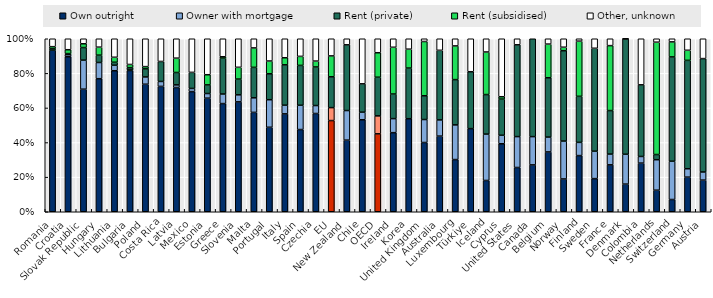
| Category | Own outright  | Owner with mortgage | Rent (private) | Rent (subsidised) | Other, unknown |
|---|---|---|---|---|---|
| Romania | 0.934 | 0 | 0.008 | 0.013 | 0.046 |
| Croatia | 0.896 | 0.012 | 0.006 | 0.022 | 0.063 |
| Slovak Republic | 0.709 | 0.168 | 0.073 | 0.022 | 0.029 |
| Hungary | 0.769 | 0.094 | 0.042 | 0.046 | 0.048 |
| Lithuania | 0.815 | 0.032 | 0.017 | 0.029 | 0.107 |
| Bulgaria | 0.817 | 0.003 | 0.013 | 0.018 | 0.149 |
| Poland | 0.737 | 0.042 | 0.047 | 0.013 | 0.161 |
| Costa Rica | 0.725 | 0.029 | 0.116 | 0 | 0.131 |
| Latvia | 0.718 | 0.015 | 0.072 | 0.083 | 0.112 |
| Mexico | 0.695 | 0.018 | 0.093 | 0 | 0.194 |
| Estonia | 0.657 | 0.027 | 0.05 | 0.059 | 0.208 |
| Greece | 0.625 | 0.055 | 0.207 | 0.008 | 0.104 |
| Slovenia | 0.635 | 0.041 | 0.091 | 0.068 | 0.165 |
| Malta | 0.574 | 0.084 | 0.176 | 0.112 | 0.053 |
| Portugal | 0.488 | 0.159 | 0.15 | 0.074 | 0.129 |
| Italy | 0.566 | 0.05 | 0.233 | 0.041 | 0.11 |
| Spain | 0.475 | 0.14 | 0.23 | 0.052 | 0.102 |
| Czechia | 0.568 | 0.046 | 0.223 | 0.034 | 0.129 |
| EU | 0.527 | 0.075 | 0.178 | 0.121 | 0.099 |
| New Zealand | 0.414 | 0.171 | 0.38 | 0 | 0.035 |
| Chile | 0.532 | 0.044 | 0.164 | 0 | 0.261 |
| OECD | 0.451 | 0.104 | 0.223 | 0.142 | 0.081 |
| Ireland | 0.457 | 0.081 | 0.142 | 0.27 | 0.049 |
| Korea | 0.538 | 0 | 0.293 | 0.109 | 0.06 |
| United Kingdom | 0.4 | 0.133 | 0.137 | 0.314 | 0.016 |
| Australia | 0.437 | 0.094 | 0.402 | 0 | 0.067 |
| Luxembourg | 0.302 | 0.2 | 0.262 | 0.195 | 0.041 |
| Türkiye | 0.481 | 0 | 0.329 | 0 | 0.191 |
| Iceland | 0.181 | 0.268 | 0.229 | 0.246 | 0.076 |
| Cyprus | 0.393 | 0.049 | 0.209 | 0.014 | 0.335 |
| United States | 0.256 | 0.179 | 0.531 | 0 | 0.035 |
| Canada | 0.271 | 0.163 | 0.566 | 0 | 0 |
| Belgium | 0.346 | 0.086 | 0.343 | 0.195 | 0.031 |
| Norway | 0.19 | 0.219 | 0.522 | 0.02 | 0.049 |
| Finland | 0.325 | 0.076 | 0.266 | 0.319 | 0.014 |
| Sweden | 0.192 | 0.159 | 0.595 | 0 | 0.055 |
| France | 0.271 | 0.062 | 0.251 | 0.375 | 0.04 |
| Denmark | 0.16 | 0.173 | 0.667 | 0 | 0 |
| Colombia | 0.281 | 0.038 | 0.414 | 0 | 0.266 |
| Netherlands | 0.125 | 0.176 | 0.03 | 0.649 | 0.02 |
| Switzerland | 0.071 | 0.221 | 0.603 | 0.087 | 0.018 |
| Germany | 0.2 | 0.048 | 0.627 | 0.058 | 0.067 |
| Austria | 0.183 | 0.047 | 0.655 | 0 | 0.115 |